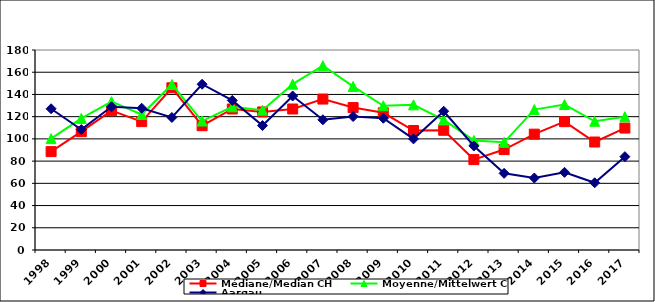
| Category | Médiane/Median CH | Moyenne/Mittelwert CH | Aargau |
|---|---|---|---|
| 1998.0 | 88.55 | 100.246 | 127.1 |
| 1999.0 | 106.5 | 118.448 | 108.4 |
| 2000.0 | 125.4 | 133.52 | 128.9 |
| 2001.0 | 115.55 | 121.946 | 127.6 |
| 2002.0 | 146 | 148.915 | 119.3 |
| 2003.0 | 111.85 | 116.062 | 149.2 |
| 2004.0 | 126.9 | 128.865 | 134.6 |
| 2005.0 | 124.25 | 125.821 | 112 |
| 2006.0 | 126.9 | 149.264 | 138.6 |
| 2007.0 | 135.85 | 165.89 | 117.2 |
| 2008.0 | 128.185 | 147.205 | 120.1 |
| 2009.0 | 123.49 | 129.818 | 118.6 |
| 2010.0 | 107.55 | 130.614 | 100 |
| 2011.0 | 107.75 | 117.142 | 124.9 |
| 2012.0 | 81.375 | 98.616 | 93.6 |
| 2013.0 | 90.385 | 96.916 | 69 |
| 2014.0 | 104.25 | 126.395 | 64.8 |
| 2015.0 | 115.5 | 130.9 | 69.9 |
| 2016.0 | 97.18 | 115.832 | 60.5 |
| 2017.0 | 109.75 | 119.906 | 84 |